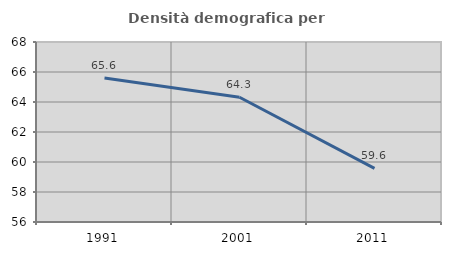
| Category | Densità demografica |
|---|---|
| 1991.0 | 65.601 |
| 2001.0 | 64.314 |
| 2011.0 | 59.575 |